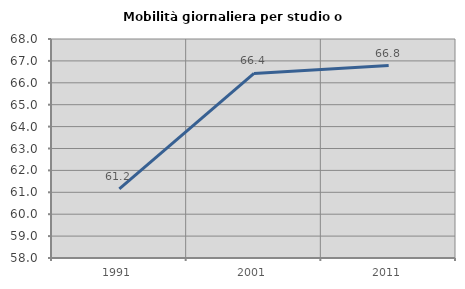
| Category | Mobilità giornaliera per studio o lavoro |
|---|---|
| 1991.0 | 61.159 |
| 2001.0 | 66.426 |
| 2011.0 | 66.787 |